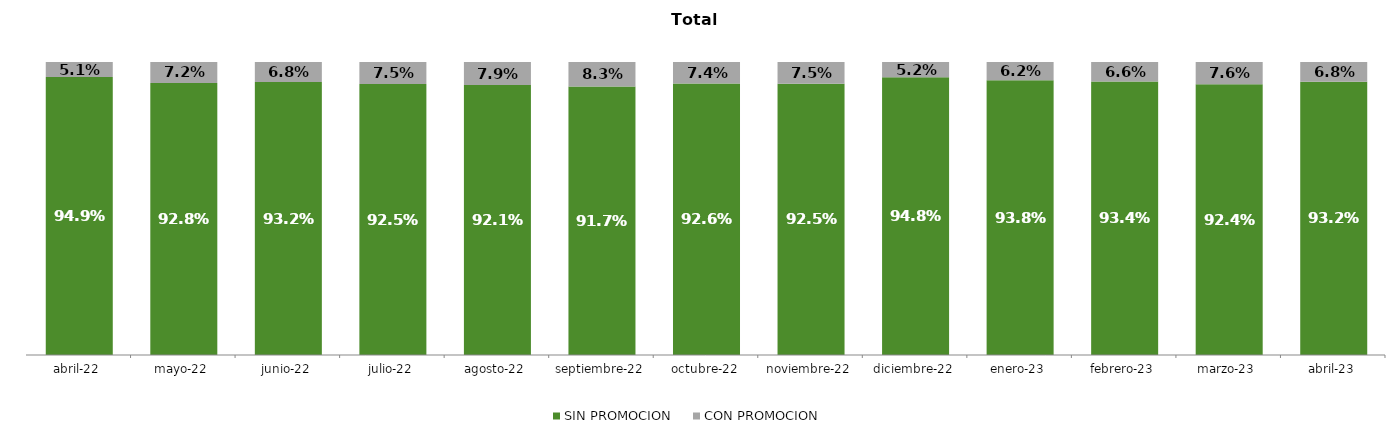
| Category | SIN PROMOCION   | CON PROMOCION   |
|---|---|---|
| 2022-04-01 | 0.949 | 0.051 |
| 2022-05-01 | 0.928 | 0.072 |
| 2022-06-01 | 0.932 | 0.068 |
| 2022-07-01 | 0.925 | 0.075 |
| 2022-08-01 | 0.921 | 0.079 |
| 2022-09-01 | 0.917 | 0.083 |
| 2022-10-01 | 0.926 | 0.074 |
| 2022-11-01 | 0.925 | 0.075 |
| 2022-12-01 | 0.948 | 0.052 |
| 2023-01-01 | 0.938 | 0.062 |
| 2023-02-01 | 0.934 | 0.066 |
| 2023-03-01 | 0.924 | 0.076 |
| 2023-04-01 | 0.932 | 0.068 |